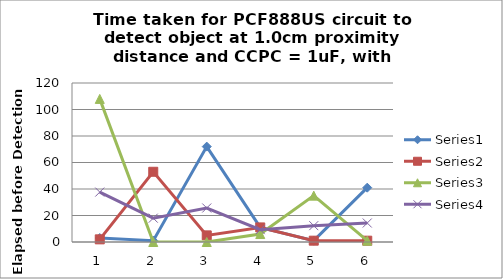
| Category | Series 0 | Series 1 | Series 2 | Series 3 |
|---|---|---|---|---|
| 0 | 3 | 2 | 108 | 37.667 |
| 1 | 1 | 53 | 0 | 18 |
| 2 | 72 | 5 | 0 | 25.667 |
| 3 | 11 | 11 | 6 | 9.333 |
| 4 | 1 | 1 | 35 | 12.333 |
| 5 | 41 | 1 | 1 | 14.333 |